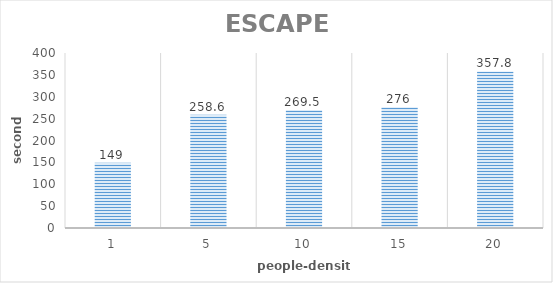
| Category | Series 0 |
|---|---|
| 1.0 | 149 |
| 5.0 | 258.6 |
| 10.0 | 269.5 |
| 15.0 | 276 |
| 20.0 | 357.8 |